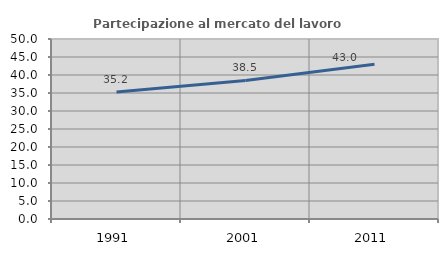
| Category | Partecipazione al mercato del lavoro  femminile |
|---|---|
| 1991.0 | 35.245 |
| 2001.0 | 38.484 |
| 2011.0 | 43.003 |